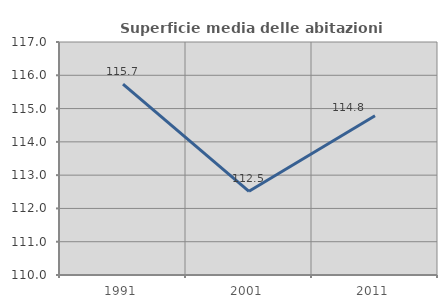
| Category | Superficie media delle abitazioni occupate |
|---|---|
| 1991.0 | 115.734 |
| 2001.0 | 112.515 |
| 2011.0 | 114.785 |